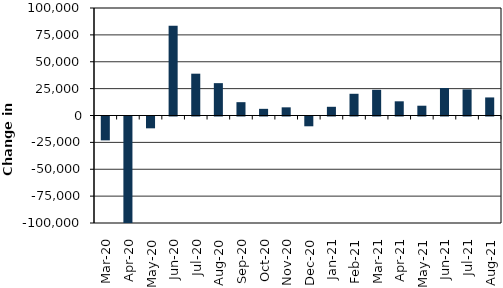
| Category | Series 0 |
|---|---|
| 2020-03-01 | -22200 |
| 2020-04-01 | -388000 |
| 2020-05-01 | -11000 |
| 2020-06-01 | 83400 |
| 2020-07-01 | 38900 |
| 2020-08-01 | 30100 |
| 2020-09-01 | 12400 |
| 2020-10-01 | 6200 |
| 2020-11-01 | 7600 |
| 2020-12-01 | -9100 |
| 2021-01-01 | 8100 |
| 2021-02-01 | 20200 |
| 2021-03-01 | 23900 |
| 2021-04-01 | 13200 |
| 2021-05-01 | 9100 |
| 2021-06-01 | 25600 |
| 2021-07-01 | 24300 |
| 2021-08-01 | 16800 |